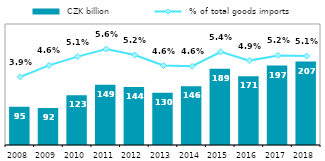
| Category |  CZK billion |
|---|---|
| 2008 | 94.842 |
| 2009 | 91.653 |
| 2010 | 123.278 |
| 2011 | 149.274 |
| 2012 | 143.98 |
| 2013 | 129.839 |
| 2014 | 145.75 |
| 2015 | 189.009 |
| 2016 | 170.63 |
| 2017 | 196.963 |
| 2018 | 206.974 |